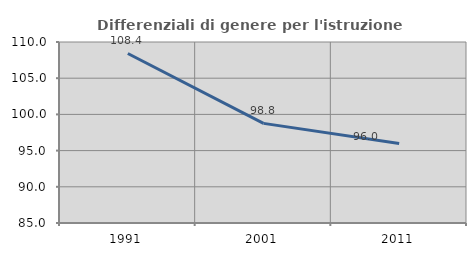
| Category | Differenziali di genere per l'istruzione superiore |
|---|---|
| 1991.0 | 108.416 |
| 2001.0 | 98.762 |
| 2011.0 | 95.989 |